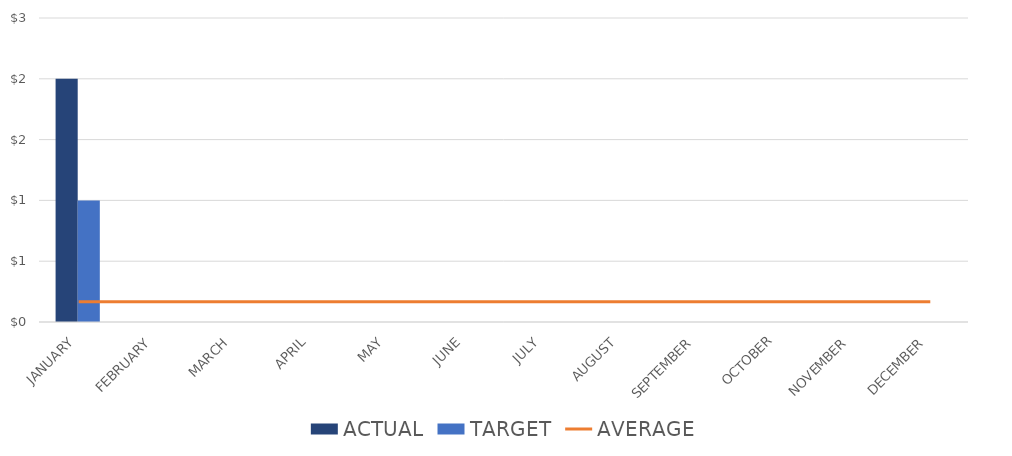
| Category | ACTUAL | TARGET |
|---|---|---|
| JANUARY | 2 | 1 |
| FEBRUARY | 0 | 0 |
| MARCH | 0 | 0 |
| APRIL | 0 | 0 |
| MAY | 0 | 0 |
| JUNE | 0 | 0 |
| JULY | 0 | 0 |
| AUGUST | 0 | 0 |
| SEPTEMBER | 0 | 0 |
| OCTOBER | 0 | 0 |
| NOVEMBER | 0 | 0 |
| DECEMBER | 0 | 0 |